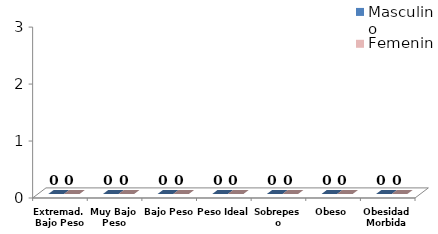
| Category | Masculino | Femenino |
|---|---|---|
| Extremad. Bajo Peso | 0 | 0 |
| Muy Bajo Peso | 0 | 0 |
| Bajo Peso | 0 | 0 |
| Peso Ideal | 0 | 0 |
| Sobrepeso | 0 | 0 |
| Obeso | 0 | 0 |
| Obesidad Morbida | 0 | 0 |